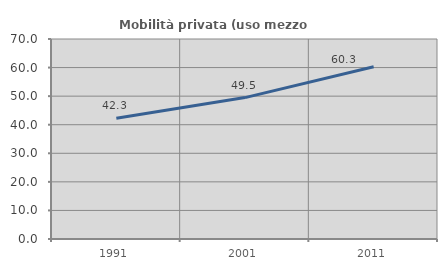
| Category | Mobilità privata (uso mezzo privato) |
|---|---|
| 1991.0 | 42.268 |
| 2001.0 | 49.493 |
| 2011.0 | 60.308 |